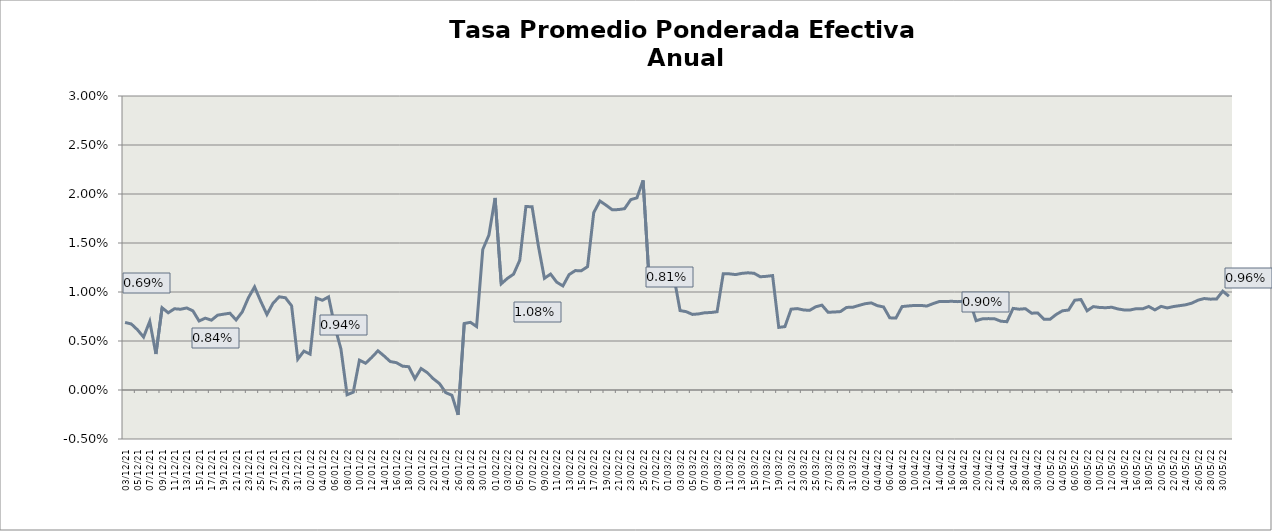
| Category | Tasa Efectiva Anual |
|---|---|
| 2021-12-03 | 0.007 |
| 2021-12-04 | 0.007 |
| 2021-12-05 | 0.006 |
| 2021-12-06 | 0.005 |
| 2021-12-07 | 0.007 |
| 2021-12-08 | 0.004 |
| 2021-12-09 | 0.008 |
| 2021-12-10 | 0.008 |
| 2021-12-11 | 0.008 |
| 2021-12-12 | 0.008 |
| 2021-12-13 | 0.008 |
| 2021-12-14 | 0.008 |
| 2021-12-15 | 0.007 |
| 2021-12-16 | 0.007 |
| 2021-12-17 | 0.007 |
| 2021-12-18 | 0.008 |
| 2021-12-19 | 0.008 |
| 2021-12-20 | 0.008 |
| 2021-12-21 | 0.007 |
| 2021-12-22 | 0.008 |
| 2021-12-23 | 0.009 |
| 2021-12-24 | 0.011 |
| 2021-12-25 | 0.009 |
| 2021-12-26 | 0.008 |
| 2021-12-27 | 0.009 |
| 2021-12-28 | 0.01 |
| 2021-12-29 | 0.009 |
| 2021-12-30 | 0.009 |
| 2021-12-31 | 0.003 |
| 2022-01-01 | 0.004 |
| 2022-01-02 | 0.004 |
| 2022-01-03 | 0.009 |
| 2022-01-04 | 0.009 |
| 2022-01-05 | 0.01 |
| 2022-01-06 | 0.006 |
| 2022-01-07 | 0.004 |
| 2022-01-08 | 0 |
| 2022-01-09 | 0 |
| 2022-01-10 | 0.003 |
| 2022-01-11 | 0.003 |
| 2022-01-12 | 0.003 |
| 2022-01-13 | 0.004 |
| 2022-01-14 | 0.003 |
| 2022-01-15 | 0.003 |
| 2022-01-16 | 0.003 |
| 2022-01-17 | 0.002 |
| 2022-01-18 | 0.002 |
| 2022-01-19 | 0.001 |
| 2022-01-20 | 0.002 |
| 2022-01-21 | 0.002 |
| 2022-01-22 | 0.001 |
| 2022-01-23 | 0.001 |
| 2022-01-24 | 0 |
| 2022-01-25 | -0.001 |
| 2022-01-26 | -0.003 |
| 2022-01-27 | 0.007 |
| 2022-01-28 | 0.007 |
| 2022-01-29 | 0.006 |
| 2022-01-30 | 0.014 |
| 2022-01-31 | 0.016 |
| 2022-02-01 | 0.02 |
| 2022-02-02 | 0.011 |
| 2022-02-03 | 0.011 |
| 2022-02-04 | 0.012 |
| 2022-02-05 | 0.013 |
| 2022-02-06 | 0.019 |
| 2022-02-07 | 0.019 |
| 2022-02-08 | 0.015 |
| 2022-02-09 | 0.011 |
| 2022-02-10 | 0.012 |
| 2022-02-11 | 0.011 |
| 2022-02-12 | 0.011 |
| 2022-02-13 | 0.012 |
| 2022-02-14 | 0.012 |
| 2022-02-15 | 0.012 |
| 2022-02-16 | 0.013 |
| 2022-02-17 | 0.018 |
| 2022-02-18 | 0.019 |
| 2022-02-19 | 0.019 |
| 2022-02-20 | 0.018 |
| 2022-02-21 | 0.018 |
| 2022-02-22 | 0.019 |
| 2022-02-23 | 0.019 |
| 2022-02-24 | 0.02 |
| 2022-02-25 | 0.021 |
| 2022-02-26 | 0.011 |
| 2022-02-27 | 0.011 |
| 2022-02-28 | 0.012 |
| 2022-03-01 | 0.012 |
| 2022-03-02 | 0.012 |
| 2022-03-03 | 0.008 |
| 2022-03-04 | 0.008 |
| 2022-03-05 | 0.008 |
| 2022-03-06 | 0.008 |
| 2022-03-07 | 0.008 |
| 2022-03-08 | 0.008 |
| 2022-03-09 | 0.008 |
| 2022-03-10 | 0.012 |
| 2022-03-11 | 0.012 |
| 2022-03-12 | 0.012 |
| 2022-03-13 | 0.012 |
| 2022-03-14 | 0.012 |
| 2022-03-15 | 0.012 |
| 2022-03-16 | 0.012 |
| 2022-03-17 | 0.012 |
| 2022-03-18 | 0.012 |
| 2022-03-19 | 0.006 |
| 2022-03-20 | 0.006 |
| 2022-03-21 | 0.008 |
| 2022-03-22 | 0.008 |
| 2022-03-23 | 0.008 |
| 2022-03-24 | 0.008 |
| 2022-03-25 | 0.008 |
| 2022-03-26 | 0.009 |
| 2022-03-27 | 0.008 |
| 2022-03-28 | 0.008 |
| 2022-03-29 | 0.008 |
| 2022-03-30 | 0.008 |
| 2022-03-31 | 0.008 |
| 2022-04-01 | 0.009 |
| 2022-04-02 | 0.009 |
| 2022-04-03 | 0.009 |
| 2022-04-04 | 0.009 |
| 2022-04-05 | 0.008 |
| 2022-04-06 | 0.007 |
| 2022-04-07 | 0.007 |
| 2022-04-08 | 0.009 |
| 2022-04-09 | 0.009 |
| 2022-04-10 | 0.009 |
| 2022-04-11 | 0.009 |
| 2022-04-12 | 0.009 |
| 2022-04-13 | 0.009 |
| 2022-04-14 | 0.009 |
| 2022-04-15 | 0.009 |
| 2022-04-16 | 0.009 |
| 2022-04-17 | 0.009 |
| 2022-04-18 | 0.009 |
| 2022-04-19 | 0.009 |
| 2022-04-20 | 0.007 |
| 2022-04-21 | 0.007 |
| 2022-04-22 | 0.007 |
| 2022-04-23 | 0.007 |
| 2022-04-24 | 0.007 |
| 2022-04-25 | 0.007 |
| 2022-04-26 | 0.008 |
| 2022-04-27 | 0.008 |
| 2022-04-28 | 0.008 |
| 2022-04-29 | 0.008 |
| 2022-04-30 | 0.008 |
| 2022-05-01 | 0.007 |
| 2022-05-02 | 0.007 |
| 2022-05-03 | 0.008 |
| 2022-05-04 | 0.008 |
| 2022-05-05 | 0.008 |
| 2022-05-06 | 0.009 |
| 2022-05-07 | 0.009 |
| 2022-05-08 | 0.008 |
| 2022-05-09 | 0.009 |
| 2022-05-10 | 0.008 |
| 2022-05-11 | 0.008 |
| 2022-05-12 | 0.008 |
| 2022-05-13 | 0.008 |
| 2022-05-14 | 0.008 |
| 2022-05-15 | 0.008 |
| 2022-05-16 | 0.008 |
| 2022-05-17 | 0.008 |
| 2022-05-18 | 0.009 |
| 2022-05-19 | 0.008 |
| 2022-05-20 | 0.009 |
| 2022-05-21 | 0.008 |
| 2022-05-22 | 0.009 |
| 2022-05-23 | 0.009 |
| 2022-05-24 | 0.009 |
| 2022-05-25 | 0.009 |
| 2022-05-26 | 0.009 |
| 2022-05-27 | 0.009 |
| 2022-05-28 | 0.009 |
| 2022-05-29 | 0.009 |
| 2022-05-30 | 0.01 |
| 2022-05-31 | 0.01 |